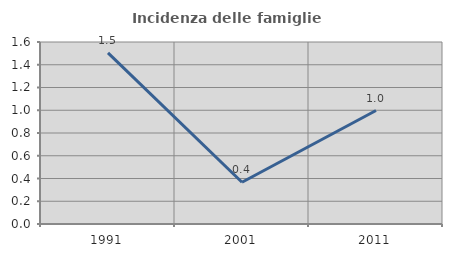
| Category | Incidenza delle famiglie numerose |
|---|---|
| 1991.0 | 1.504 |
| 2001.0 | 0.367 |
| 2011.0 | 0.998 |